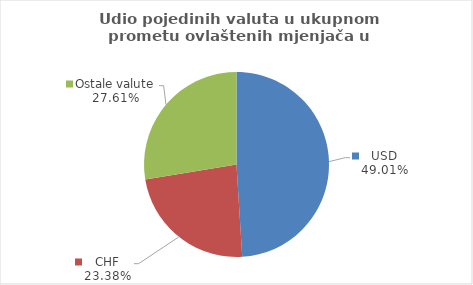
| Category | Series 0 |
|---|---|
| USD | 49.011 |
| CHF | 23.38 |
| Ostale valute | 27.61 |